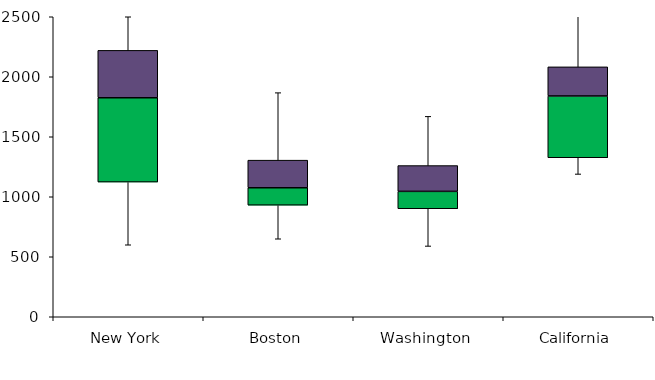
| Category | Q1 | Q2-Q1 | Q3-Q2 |
|---|---|---|---|
| New York | 1122.5 | 702.5 | 395 |
| Boston | 930 | 145 | 230 |
| Washington | 900 | 145 | 215 |
| California | 1325 | 515 | 242.5 |